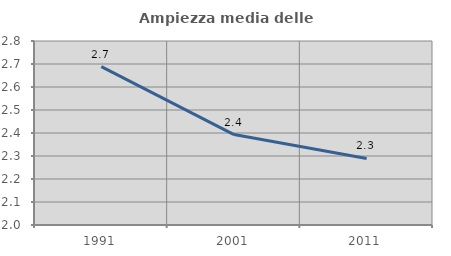
| Category | Ampiezza media delle famiglie |
|---|---|
| 1991.0 | 2.689 |
| 2001.0 | 2.393 |
| 2011.0 | 2.29 |